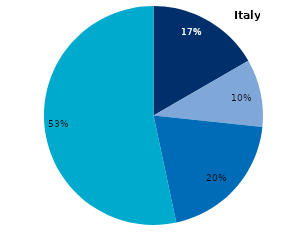
| Category | Series 0 |
|---|---|
| Research and Development | 0.167 |
| Alpha version | 0.1 |
| Beta version | 0.2 |
| Commercialisation | 0.533 |